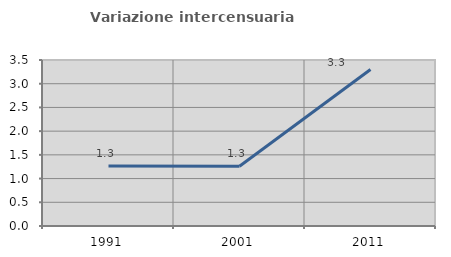
| Category | Variazione intercensuaria annua |
|---|---|
| 1991.0 | 1.267 |
| 2001.0 | 1.259 |
| 2011.0 | 3.298 |